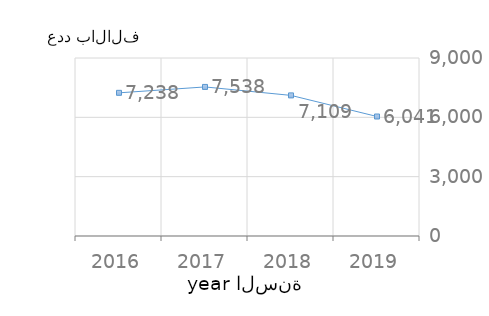
| Category | القيمة
Value |
|---|---|
| 2016.0 | 7238.25 |
| 2017.0 | 7537.537 |
| 2018.0 | 7109.4 |
| 2019.0 | 6041.347 |